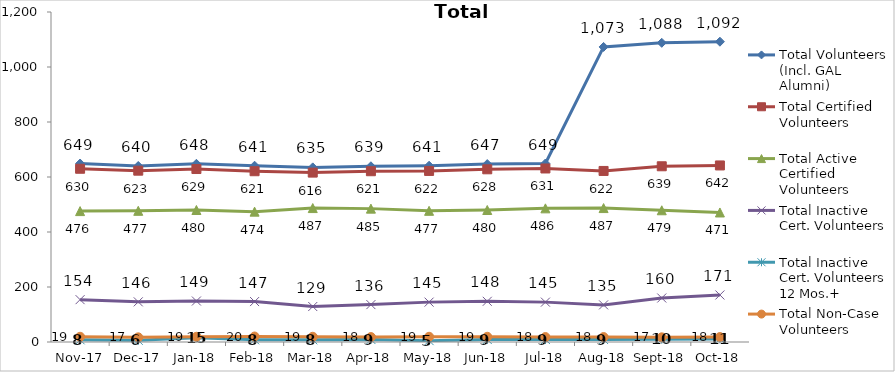
| Category | Total Volunteers (Incl. GAL Alumni) | Total Certified Volunteers | Total Active Certified Volunteers | Total Inactive Cert. Volunteers | Total Inactive Cert. Volunteers 12 Mos.+ | Total Non-Case Volunteers |
|---|---|---|---|---|---|---|
| 2017-11-01 | 649 | 630 | 476 | 154 | 8 | 19 |
| 2017-12-01 | 640 | 623 | 477 | 146 | 6 | 17 |
| 2018-01-01 | 648 | 629 | 480 | 149 | 15 | 19 |
| 2018-02-01 | 641 | 621 | 474 | 147 | 8 | 20 |
| 2018-03-01 | 635 | 616 | 487 | 129 | 8 | 19 |
| 2018-04-01 | 639 | 621 | 485 | 136 | 9 | 18 |
| 2018-05-01 | 641 | 622 | 477 | 145 | 5 | 19 |
| 2018-06-01 | 647 | 628 | 480 | 148 | 9 | 19 |
| 2018-07-01 | 649 | 631 | 486 | 145 | 9 | 18 |
| 2018-08-01 | 1073 | 622 | 487 | 135 | 9 | 18 |
| 2018-09-01 | 1088 | 639 | 479 | 160 | 10 | 17 |
| 2018-10-01 | 1092 | 642 | 471 | 171 | 11 | 18 |